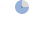
| Category | Datos | Series 5 | Series 6 | Series 7 | Series 3 | Series 1 |
|---|---|---|---|---|---|---|
| no | 125 | 125 | 125 | 125 | 125 | 125 |
| si | 450 | 450 | 450 | 450 | 450 | 450 |